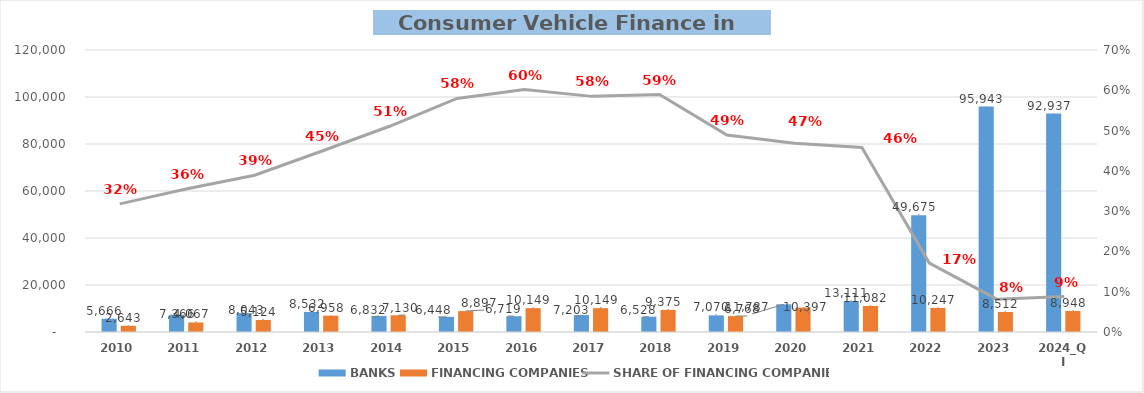
| Category | BANKS | FINANCING COMPANIES |
|---|---|---|
| 2010 | 5665.615 | 2643.169 |
| 2011 | 7366.42 | 4066.867 |
| 2012 | 8042.797 | 5124.261 |
| 2013 | 8531.566 | 6958.23 |
| 2014 | 6832.186 | 7129.957 |
| 2015 | 6447.808 | 8897.137 |
| 2016 | 6719.498 | 10148.982 |
| 2017 | 7202.608 | 10148.903 |
| 2018 | 6528.18 | 9375.099 |
| 2019 | 7070.3 | 6767.535 |
| 2020 | 11786.807 | 10397.228 |
| 2021 | 13111.088 | 11081.747 |
| 2022 | 49674.663 | 10247.463 |
| 2023 | 95943.138 | 8512.197 |
| 2024_QI | 92937.352 | 8947.763 |